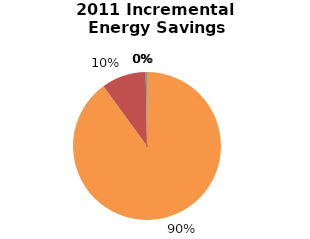
| Category | Incremental Energy Savings (kWh) |
|---|---|
| Consumer Program Total | 55335.575 |
| Business Program Total | 5986.374 |
| Industrial Program Total | 0 |
| Home Assistance Program Total | 0 |
| Pre-2011 Programs completed in 2011 Total | 174.093 |